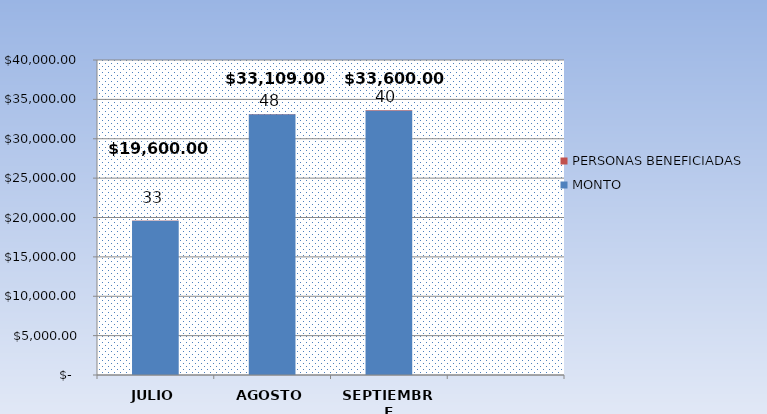
| Category | MONTO | PERSONAS BENEFICIADAS  |
|---|---|---|
| JULIO | 19600 | 33 |
| AGOSTO | 33109 | 48 |
| SEPTIEMBRE | 33600 | 40 |